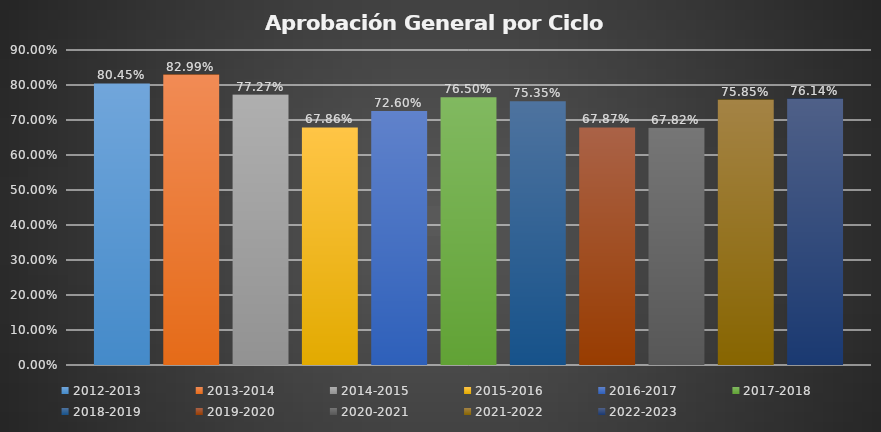
| Category | 2012-2013 | 2013-2014 | 2014-2015 | 2015-2016  | 2016-2017 | 2017-2018 | 2018-2019 | 2019-2020 | 2020-2021 | 2021-2022 | 2022-2023 |
|---|---|---|---|---|---|---|---|---|---|---|---|
| 0 | 0.804 | 0.83 | 0.773 | 0.679 | 0.726 | 0.765 | 0.754 | 0.679 | 0.678 | 0.758 | 0.761 |